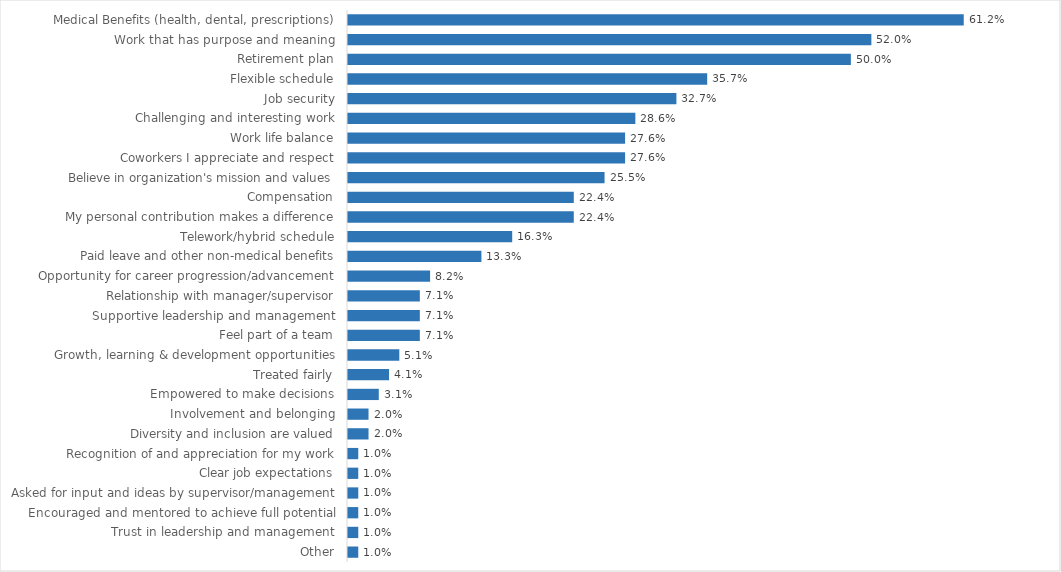
| Category | Fish & Wildlife |
|---|---|
| Medical Benefits (health, dental, prescriptions) | 0.612 |
| Work that has purpose and meaning | 0.52 |
| Retirement plan | 0.5 |
| Flexible schedule | 0.357 |
| Job security | 0.327 |
| Challenging and interesting work | 0.286 |
| Work life balance | 0.276 |
| Coworkers I appreciate and respect | 0.276 |
| Believe in organization's mission and values | 0.255 |
| Compensation | 0.224 |
| My personal contribution makes a difference | 0.224 |
| Telework/hybrid schedule | 0.163 |
| Paid leave and other non-medical benefits | 0.133 |
| Opportunity for career progression/advancement | 0.082 |
| Relationship with manager/supervisor | 0.071 |
| Supportive leadership and management | 0.071 |
| Feel part of a team | 0.071 |
| Growth, learning & development opportunities | 0.051 |
| Treated fairly | 0.041 |
| Empowered to make decisions | 0.031 |
| Involvement and belonging | 0.02 |
| Diversity and inclusion are valued | 0.02 |
| Recognition of and appreciation for my work | 0.01 |
| Clear job expectations | 0.01 |
| Asked for input and ideas by supervisor/management | 0.01 |
| Encouraged and mentored to achieve full potential | 0.01 |
| Trust in leadership and management | 0.01 |
| Other | 0.01 |